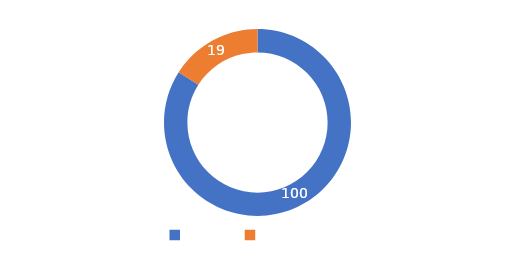
| Category | Series 0 |
|---|---|
| META  | 100 |
| CUMPLIMIENTO | 19 |